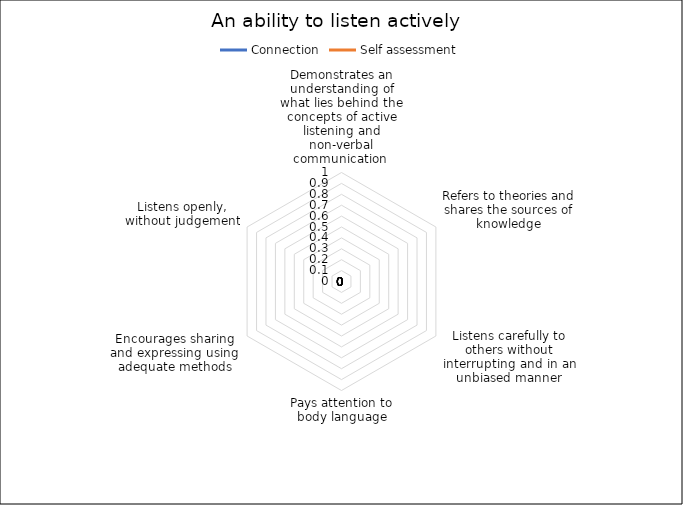
| Category | Connection | Self assessment |
|---|---|---|
| Demonstrates an understanding of what lies behind the concepts of active listening and non-verbal communication  | 0 | 0 |
| Refers to theories and shares the sources of knowledge | 0 | 0 |
| Listens carefully to others without interrupting and in an unbiased manner | 0 | 0 |
| Pays attention to body language | 0 | 0 |
| Encourages sharing and expressing using adequate methods | 0 | 0 |
| Listens openly, without judgement | 0 | 0 |